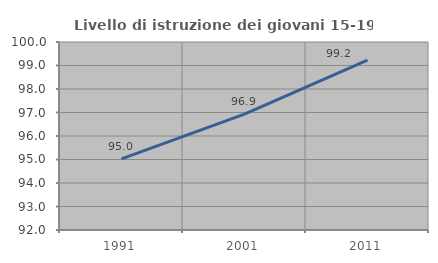
| Category | Livello di istruzione dei giovani 15-19 anni |
|---|---|
| 1991.0 | 95.028 |
| 2001.0 | 96.933 |
| 2011.0 | 99.225 |